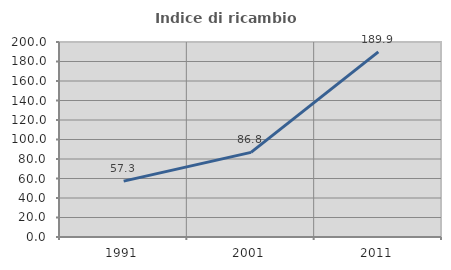
| Category | Indice di ricambio occupazionale  |
|---|---|
| 1991.0 | 57.329 |
| 2001.0 | 86.782 |
| 2011.0 | 189.917 |